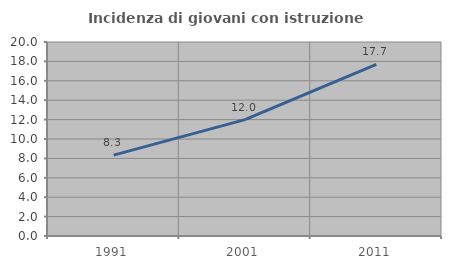
| Category | Incidenza di giovani con istruzione universitaria |
|---|---|
| 1991.0 | 8.333 |
| 2001.0 | 12 |
| 2011.0 | 17.687 |